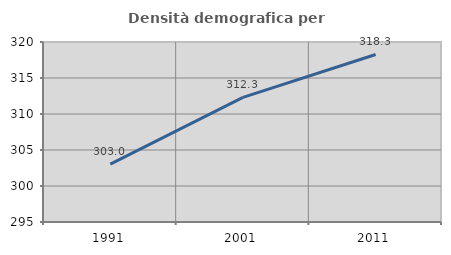
| Category | Densità demografica |
|---|---|
| 1991.0 | 303.034 |
| 2001.0 | 312.308 |
| 2011.0 | 318.271 |